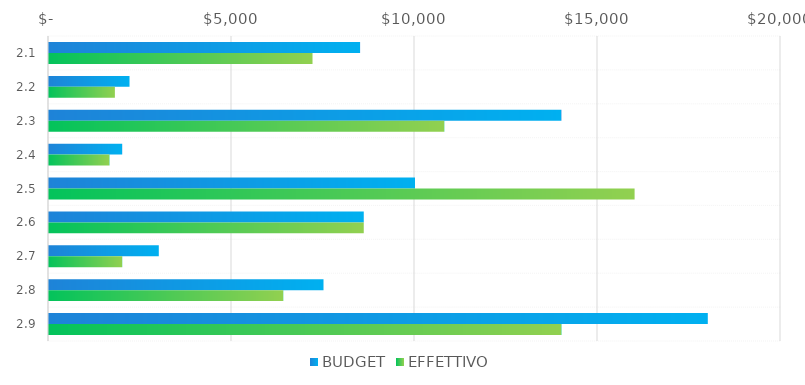
| Category | BUDGET | EFFETTIVO |
|---|---|---|
| 2.1 | 8500 | 7200 |
| 2.2 | 2200 | 1800 |
| 2.3 | 14000 | 10800 |
| 2.4 | 2000 | 1650 |
| 2.5 | 10000 | 16000 |
| 2.6 | 8600 | 8600 |
| 2.7 | 3000 | 2000 |
| 2.8 | 7500 | 6400 |
| 2.9 | 18000 | 14000 |